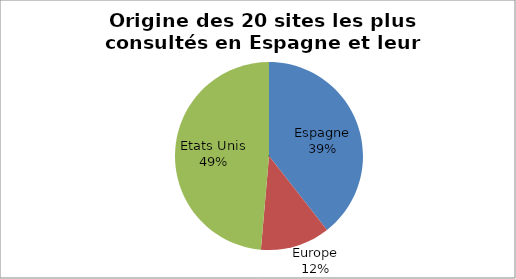
| Category | Series 0 |
|---|---|
| 0 | 0.394 |
| 1 | 0.12 |
| 2 | 0.486 |